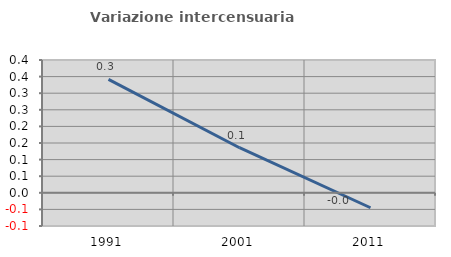
| Category | Variazione intercensuaria annua |
|---|---|
| 1991.0 | 0.342 |
| 2001.0 | 0.136 |
| 2011.0 | -0.045 |